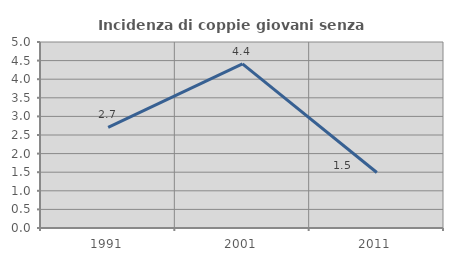
| Category | Incidenza di coppie giovani senza figli |
|---|---|
| 1991.0 | 2.703 |
| 2001.0 | 4.412 |
| 2011.0 | 1.493 |